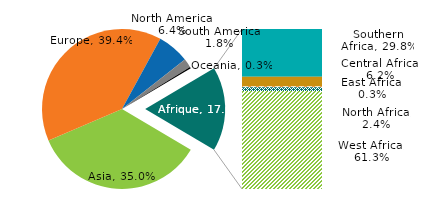
| Category | Series 0 |
|---|---|
| Asia | 44877.515 |
| Europe | 50465.247 |
| North America | 8260.056 |
| South America | 2269.894 |
| Oceania | 386.637 |
| Southern Africa | 6506.571 |
| Central Africa | 1353.883 |
| East Africa | 72.292 |
| North Africa | 518.209 |
| West Africa | 13379.887 |